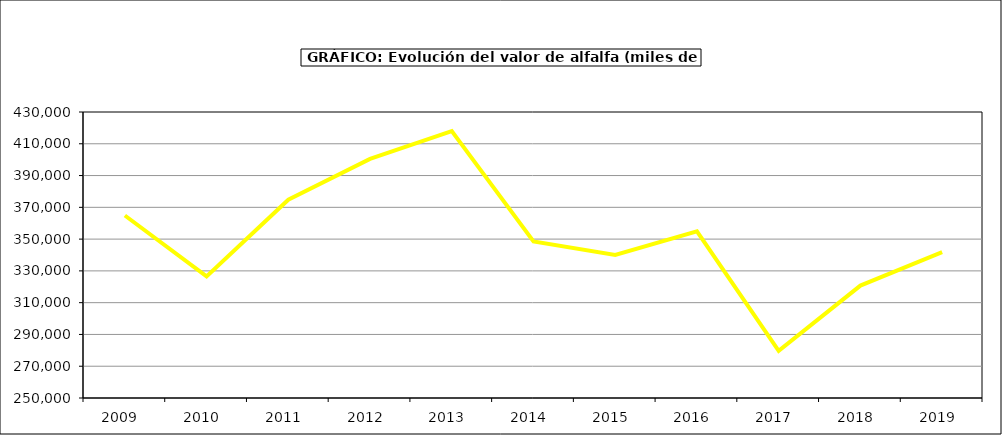
| Category | Valor |
|---|---|
| 2009.0 | 364856.04 |
| 2010.0 | 326568.228 |
| 2011.0 | 374822.873 |
| 2012.0 | 400520.754 |
| 2013.0 | 417975.354 |
| 2014.0 | 348510.593 |
| 2015.0 | 340064 |
| 2016.0 | 354947 |
| 2017.0 | 279674.885 |
| 2018.0 | 320740.744 |
| 2019.0 | 341773.556 |